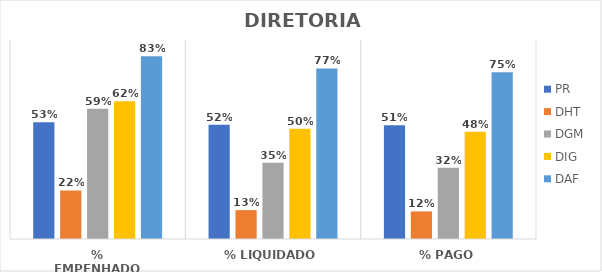
| Category | PR | DHT | DGM | DIG | DAF |
|---|---|---|---|---|---|
| % EMPENHADO | 0.528 | 0.219 | 0.589 | 0.623 | 0.826 |
| % LIQUIDADO | 0.517 | 0.131 | 0.345 | 0.498 | 0.771 |
| % PAGO | 0.515 | 0.125 | 0.323 | 0.485 | 0.754 |